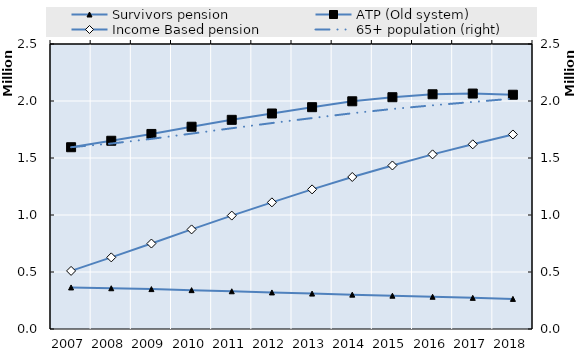
| Category | Survivors pension | ATP (Old system) | Income Based pension |
|---|---|---|---|
| 2007.0 | 364583 | 1594497 | 509706 |
| 2008.0 | 357512 | 1651215 | 628197 |
| 2009.0 | 350044 | 1710962 | 749616 |
| 2010.0 | 340869 | 1774380 | 873548 |
| 2011.0 | 330877 | 1834713 | 994874 |
| 2012.0 | 320797 | 1890476 | 1110937 |
| 2013.0 | 310635 | 1945738 | 1224700 |
| 2014.0 | 301262 | 1997402 | 1333519 |
| 2015.0 | 292025 | 2033231 | 1434426 |
| 2016.0 | 282880 | 2059049 | 1531924 |
| 2017.0 | 273229 | 2065245 | 1619985 |
| 2018.0 | 264194 | 2054874 | 1706426 |